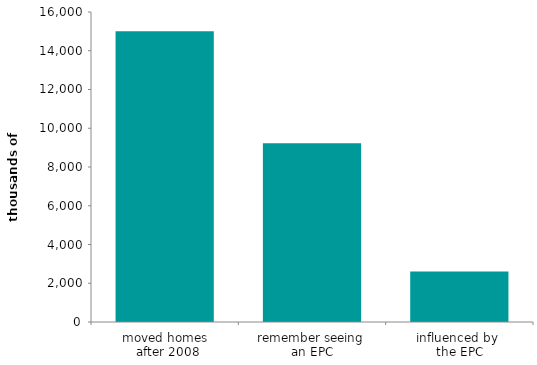
| Category | Series 0 |
|---|---|
| moved homes
 after 2008 | 15012.371 |
| remember seeing 
an EPC | 9231.391 |
| influenced by 
the EPC | 2603.273 |